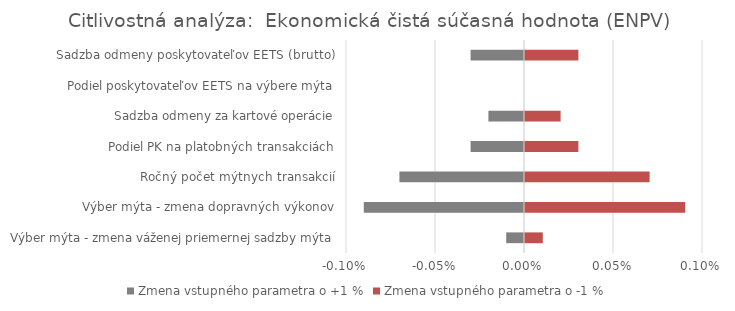
| Category | Zmena vstupného parametra o +1 % | Zmena vstupného parametra o -1 % |
|---|---|---|
| Výber mýta - zmena váženej priemernej sadzby mýta | 0 | 0 |
| Výber mýta - zmena dopravných výkonov | -0.001 | 0.001 |
| Ročný počet mýtnych transakcií | -0.001 | 0.001 |
| Podiel PK na platobných transakciách | 0 | 0 |
| Sadzba odmeny za kartové operácie | 0 | 0 |
| Podiel poskytovateľov EETS na výbere mýta | 0 | 0 |
| Sadzba odmeny poskytovateľov EETS (brutto) | 0 | 0 |